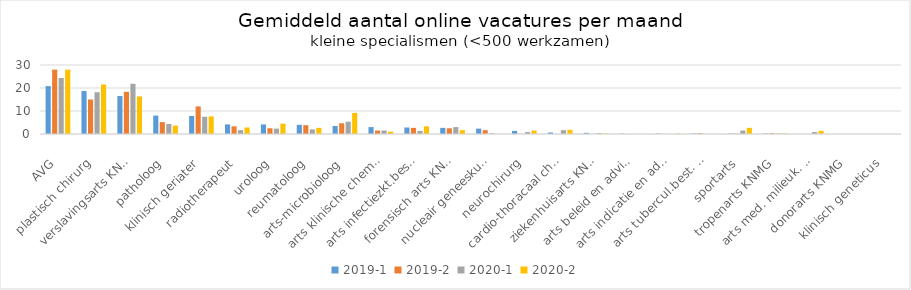
| Category | 2019-1 | 2019-2 | 2020-1 | 2020-2 |
|---|---|---|---|---|
| AVG | 20.833 | 28 | 24.333 | 28 |
| plastisch chirurg | 18.667 | 15 | 18.167 | 21.5 |
| verslavingsarts KNMG | 16.5 | 18.333 | 21.833 | 16.333 |
| patholoog | 8 | 5.167 | 4.333 | 3.667 |
| klinisch geriater | 7.833 | 12 | 7.5 | 7.667 |
| radiotherapeut | 4.167 | 3.333 | 1.667 | 2.833 |
| uroloog | 4.167 | 2.5 | 2.333 | 4.5 |
| reumatoloog | 4 | 3.833 | 2 | 2.667 |
| arts-microbioloog | 3.5 | 4.667 | 5.333 | 9.167 |
| arts klinische chemie | 3 | 1.5 | 1.5 | 1 |
| arts infectiezkt.bestr. KNMG | 2.833 | 2.667 | 1.333 | 3.333 |
| forensisch arts KNMG | 2.667 | 2.5 | 3 | 1.667 |
| nucleair geneeskundige | 2.333 | 1.667 | 0.333 | 0 |
| neurochirurg | 1.333 | 0 | 0.833 | 1.5 |
| cardio-thoracaal chirurg | 0.667 | 0 | 1.667 | 1.833 |
| ziekenhuisarts KNMG | 0.5 | 0 | 0.333 | 0.167 |
| arts beleid en advies KNMG | 0.167 | 0 | 0 | 0 |
| arts indicatie en advies KNMG | 0.167 | 0 | 0 | 0.167 |
| arts tubercul.best. KNMG | 0.167 | 0.333 | 0 | 0 |
| sportarts | 0.167 | 0.167 | 1.5 | 2.667 |
| tropenarts KNMG | 0.167 | 0.333 | 0.167 | 0.167 |
| arts med. milieuk. KNMG | 0 | 0 | 0.833 | 1.333 |
| donorarts KNMG | 0 | 0 | 0 | 0 |
| klinisch geneticus | 0 | 0 | 0 | 0 |